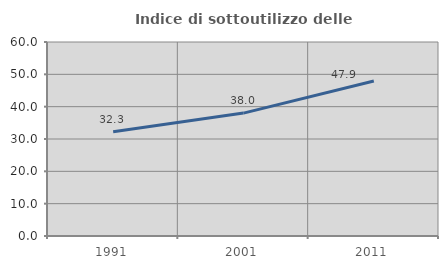
| Category | Indice di sottoutilizzo delle abitazioni  |
|---|---|
| 1991.0 | 32.271 |
| 2001.0 | 38.011 |
| 2011.0 | 47.936 |